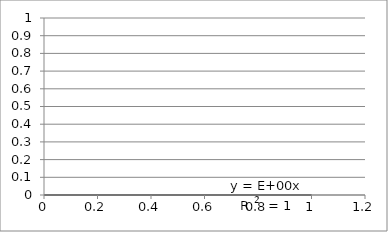
| Category | Series 0 |
|---|---|
| 1.0001189684932528 | 0 |
| 0.6990889728292715 | 0 |
| 0.5229977137735903 | 0 |
| 0.3980589771652903 | 0 |
| 0.30114896415723397 | 0 |
| 0.2219677181096091 | 0 |
| 0.15502092847899585 | 0 |
| 0.0970289815013091 | 0 |
| 0.04587645905392787 | 0 |
| 0.00011896849325278248 | 0 |